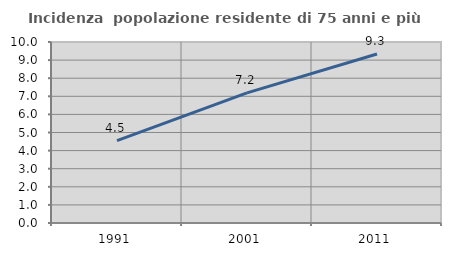
| Category | Incidenza  popolazione residente di 75 anni e più |
|---|---|
| 1991.0 | 4.55 |
| 2001.0 | 7.191 |
| 2011.0 | 9.335 |